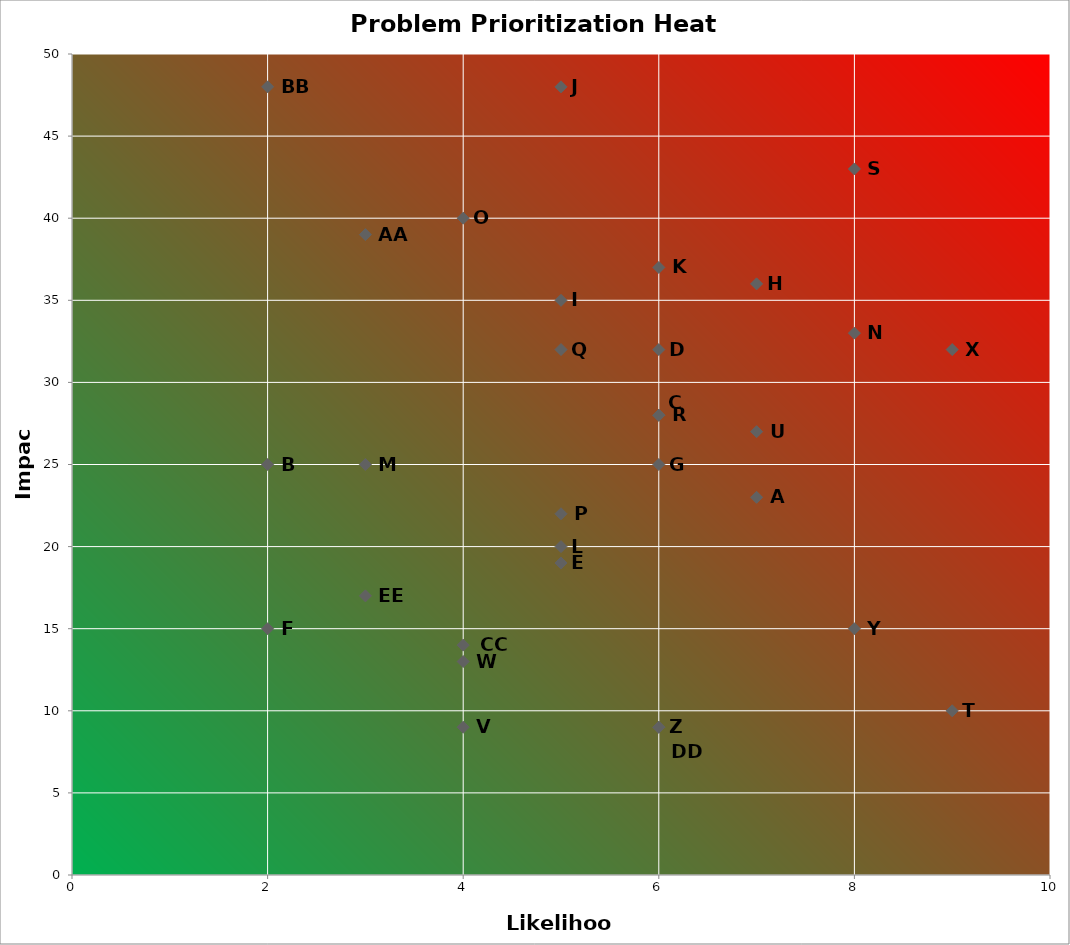
| Category | Series 0 |
|---|---|
| 7.0 | 23 |
| 2.0 | 25 |
| 6.0 | 28 |
| 6.0 | 32 |
| 5.0 | 19 |
| 2.0 | 15 |
| 6.0 | 25 |
| 7.0 | 36 |
| 5.0 | 35 |
| 5.0 | 48 |
| 6.0 | 37 |
| 5.0 | 20 |
| 3.0 | 25 |
| 8.0 | 33 |
| 4.0 | 40 |
| 5.0 | 22 |
| 5.0 | 32 |
| 6.0 | 28 |
| 8.0 | 43 |
| 9.0 | 10 |
| 7.0 | 27 |
| 4.0 | 9 |
| 4.0 | 13 |
| 9.0 | 32 |
| 8.0 | 15 |
| 6.0 | 9 |
| 3.0 | 39 |
| 2.0 | 48 |
| 4.0 | 14 |
| 6.0 | 9 |
| 3.0 | 17 |